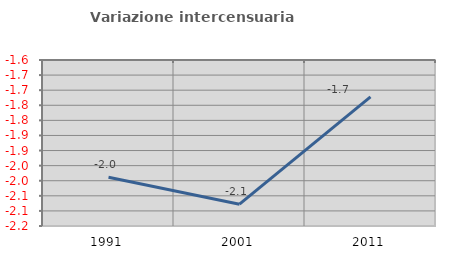
| Category | Variazione intercensuaria annua |
|---|---|
| 1991.0 | -1.988 |
| 2001.0 | -2.078 |
| 2011.0 | -1.722 |